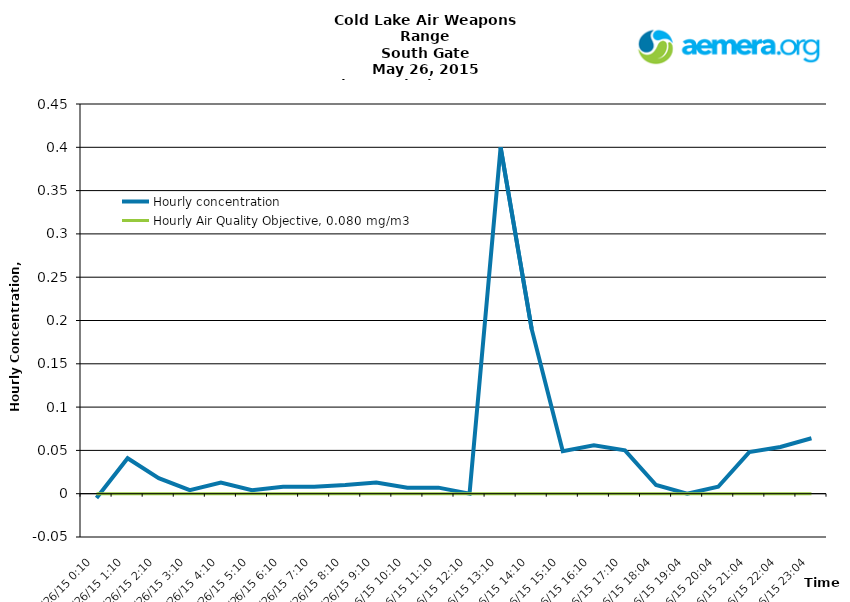
| Category | Hourly concentration | Hourly Air Quality Objective, 0.080 mg/m3 |
|---|---|---|
| 5/26/15 | -0.005 | 0.08 |
| 5/26/15 | 0.041 | 0.08 |
| 5/26/15 | 0.018 | 0.08 |
| 5/26/15 | 0.004 | 0.08 |
| 5/26/15 | 0.013 | 0.08 |
| 5/26/15 | 0.004 | 0.08 |
| 5/26/15 | 0.008 | 0.08 |
| 5/26/15 | 0.008 | 0.08 |
| 5/26/15 | 0.01 | 0.08 |
| 5/26/15 | 0.013 | 0.08 |
| 5/26/15 | 0.007 | 0.08 |
| 5/26/15 | 0.007 | 0.08 |
| 5/26/15 | 0 | 0.08 |
| 5/26/15 | 0.4 | 0.08 |
| 5/26/15 | 0.19 | 0.08 |
| 5/26/15 | 0.049 | 0.08 |
| 5/26/15 | 0.056 | 0.08 |
| 5/26/15 | 0.05 | 0.08 |
| 5/26/15 | 0.01 | 0.08 |
| 5/26/15 | 0 | 0.08 |
| 5/26/15 | 0.008 | 0.08 |
| 5/26/15 | 0.048 | 0.08 |
| 5/26/15 | 0.054 | 0.08 |
| 5/26/15 | 0.064 | 0.08 |